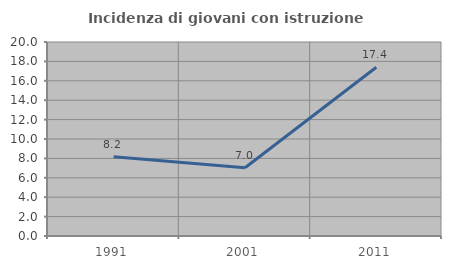
| Category | Incidenza di giovani con istruzione universitaria |
|---|---|
| 1991.0 | 8.163 |
| 2001.0 | 7.042 |
| 2011.0 | 17.391 |